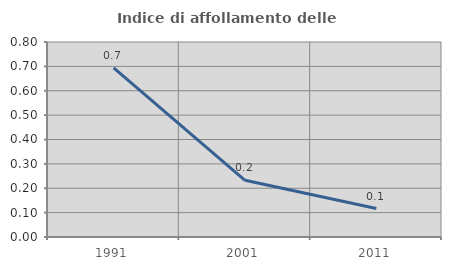
| Category | Indice di affollamento delle abitazioni  |
|---|---|
| 1991.0 | 0.694 |
| 2001.0 | 0.233 |
| 2011.0 | 0.117 |